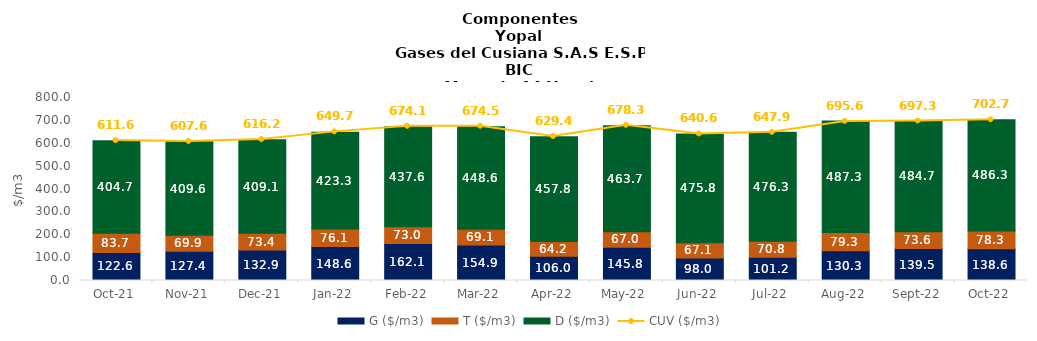
| Category | G ($/m3) | T ($/m3) | D ($/m3) |
|---|---|---|---|
| 2021-10-01 | 122.57 | 83.66 | 404.73 |
| 2021-11-01 | 127.39 | 69.89 | 409.55 |
| 2021-12-01 | 132.89 | 73.37 | 409.12 |
| 2022-01-01 | 148.58 | 76.09 | 423.28 |
| 2022-02-01 | 162.07 | 73 | 437.58 |
| 2022-03-01 | 154.9 | 69.08 | 448.55 |
| 2022-04-01 | 105.95 | 64.24 | 457.83 |
| 2022-05-01 | 145.79 | 66.96 | 463.72 |
| 2022-06-01 | 98.04 | 67.12 | 475.76 |
| 2022-07-01 | 101.2 | 70.76 | 476.31 |
| 2022-08-01 | 130.34 | 79.28 | 487.29 |
| 2022-09-01 | 139.5 | 73.63 | 484.74 |
| 2022-10-01 | 138.55 | 78.32 | 486.3 |